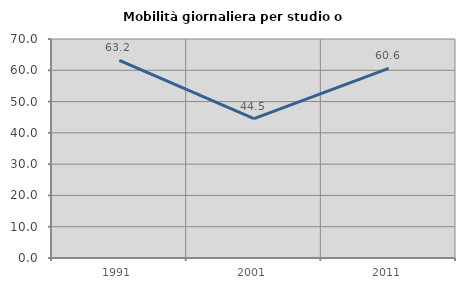
| Category | Mobilità giornaliera per studio o lavoro |
|---|---|
| 1991.0 | 63.182 |
| 2001.0 | 44.55 |
| 2011.0 | 60.622 |